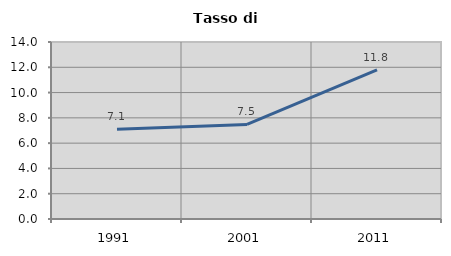
| Category | Tasso di disoccupazione   |
|---|---|
| 1991.0 | 7.098 |
| 2001.0 | 7.48 |
| 2011.0 | 11.792 |